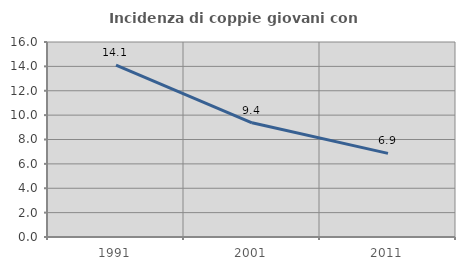
| Category | Incidenza di coppie giovani con figli |
|---|---|
| 1991.0 | 14.11 |
| 2001.0 | 9.369 |
| 2011.0 | 6.862 |